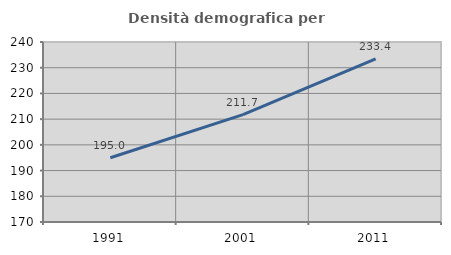
| Category | Densità demografica |
|---|---|
| 1991.0 | 195.004 |
| 2001.0 | 211.732 |
| 2011.0 | 233.407 |